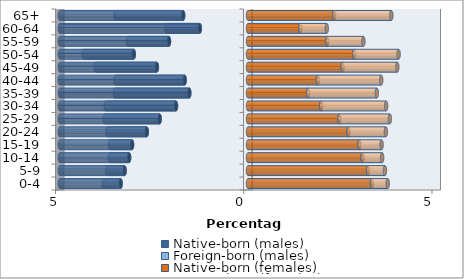
| Category | Native-born (males) | Foreign-born (males) | Native-born (females) | Foreign-born (females) |
|---|---|---|---|---|
| 0-4 | -3.384 | -0.445 | 3.292 | 0.42 |
| 5-9 | -3.278 | -0.462 | 3.19 | 0.448 |
| 10-14 | -3.158 | -0.508 | 3.041 | 0.522 |
| 15-19 | -3.08 | -0.586 | 2.957 | 0.593 |
| 20-24 | -2.688 | -1.048 | 2.671 | 0.991 |
| 25-29 | -2.346 | -1.457 | 2.427 | 1.341 |
| 30-34 | -1.912 | -1.866 | 1.944 | 1.725 |
| 35-39 | -1.559 | -1.979 | 1.595 | 1.828 |
| 40-44 | -1.683 | -1.835 | 1.856 | 1.683 |
| 45-49 | -2.42 | -1.623 | 2.516 | 1.45 |
| 50-54 | -3.034 | -1.33 | 2.819 | 1.182 |
| 55-59 | -2.099 | -1.087 | 2.106 | 0.96 |
| 60-64 | -1.281 | -0.879 | 1.39 | 0.702 |
| 65+ | -1.722 | -1.796 | 2.29 | 1.517 |